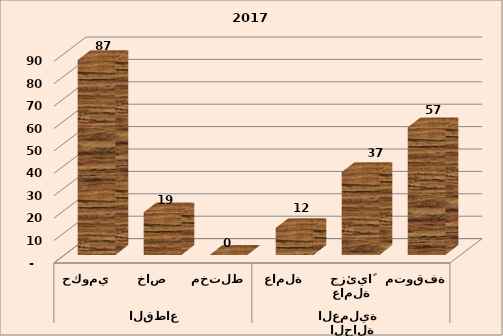
| Category | Series 0 |
|---|---|
| 0 | 87 |
| 1 | 19 |
| 2 | 0 |
| 3 | 12 |
| 4 | 37 |
| 5 | 57 |